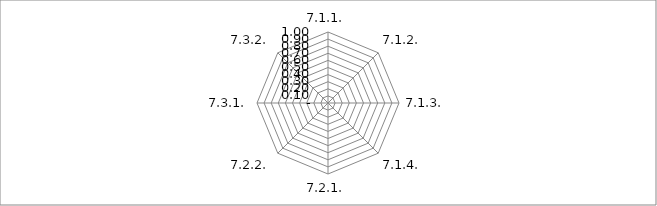
| Category | Series 0 |
|---|---|
| 7.1.1. | 0 |
| 7.1.2. | 0 |
| 7.1.3. | 0 |
| 7.1.4. | 0 |
| 7.2.1. | 0 |
| 7.2.2. | 0 |
| 7.3.1. | 0 |
| 7.3.2. | 0 |